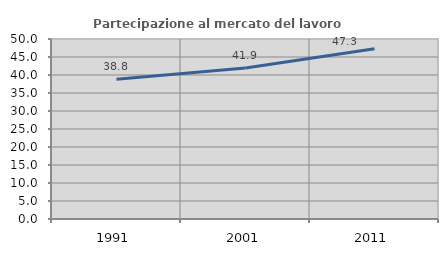
| Category | Partecipazione al mercato del lavoro  femminile |
|---|---|
| 1991.0 | 38.788 |
| 2001.0 | 41.925 |
| 2011.0 | 47.309 |